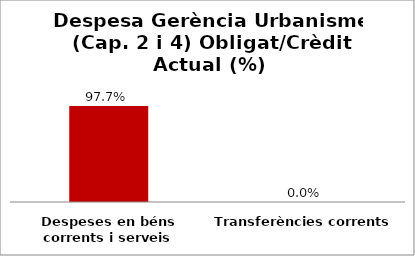
| Category | Series 0 |
|---|---|
| Despeses en béns corrents i serveis | 0.977 |
| Transferències corrents | 0 |